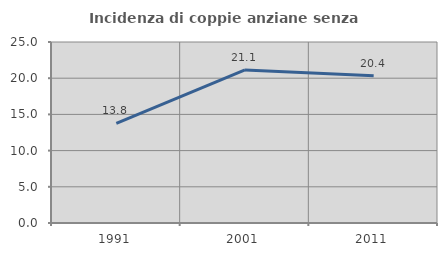
| Category | Incidenza di coppie anziane senza figli  |
|---|---|
| 1991.0 | 13.75 |
| 2001.0 | 21.138 |
| 2011.0 | 20.354 |